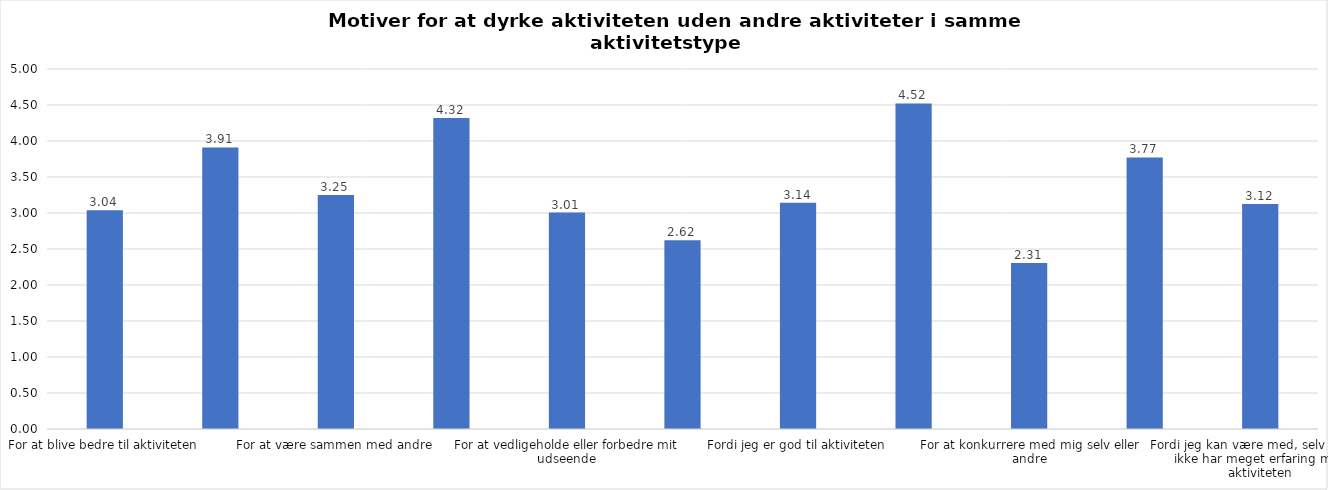
| Category | Gennemsnit |
|---|---|
| For at blive bedre til aktiviteten | 3.038 |
| For at vedligeholde eller forbedre min sundhed (fx helbred, fysisk form) | 3.91 |
| For at være sammen med andre | 3.25 |
| For at gøre noget godt for mig selv | 4.321 |
| For at vedligeholde eller forbedre mit udseende | 3.006 |
| Fordi andre i min omgangskreds opmuntrer mig til det | 2.622 |
| Fordi jeg er god til aktiviteten | 3.141 |
| Fordi jeg godt kan lide aktiviteten | 4.521 |
| For at konkurrere med mig selv eller andre | 2.306 |
| Fordi aktiviteten passer godt ind i min hverdag | 3.772 |
| Fordi jeg kan være med, selv om jeg ikke har meget erfaring med aktiviteten | 3.124 |